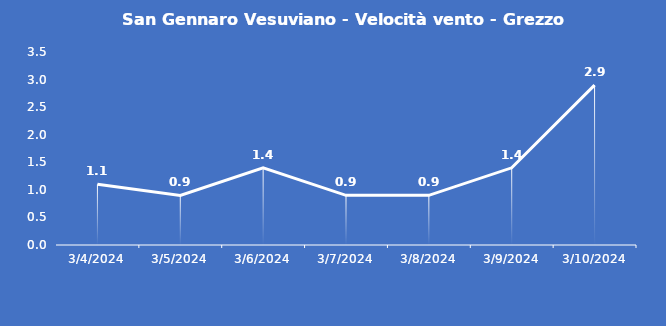
| Category | San Gennaro Vesuviano - Velocità vento - Grezzo (m/s) |
|---|---|
| 3/4/24 | 1.1 |
| 3/5/24 | 0.9 |
| 3/6/24 | 1.4 |
| 3/7/24 | 0.9 |
| 3/8/24 | 0.9 |
| 3/9/24 | 1.4 |
| 3/10/24 | 2.9 |